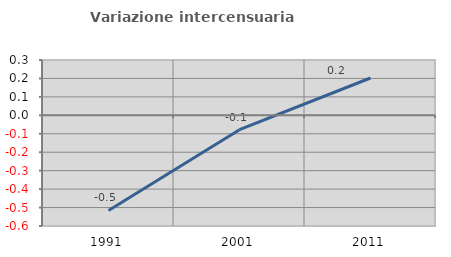
| Category | Variazione intercensuaria annua |
|---|---|
| 1991.0 | -0.516 |
| 2001.0 | -0.078 |
| 2011.0 | 0.203 |